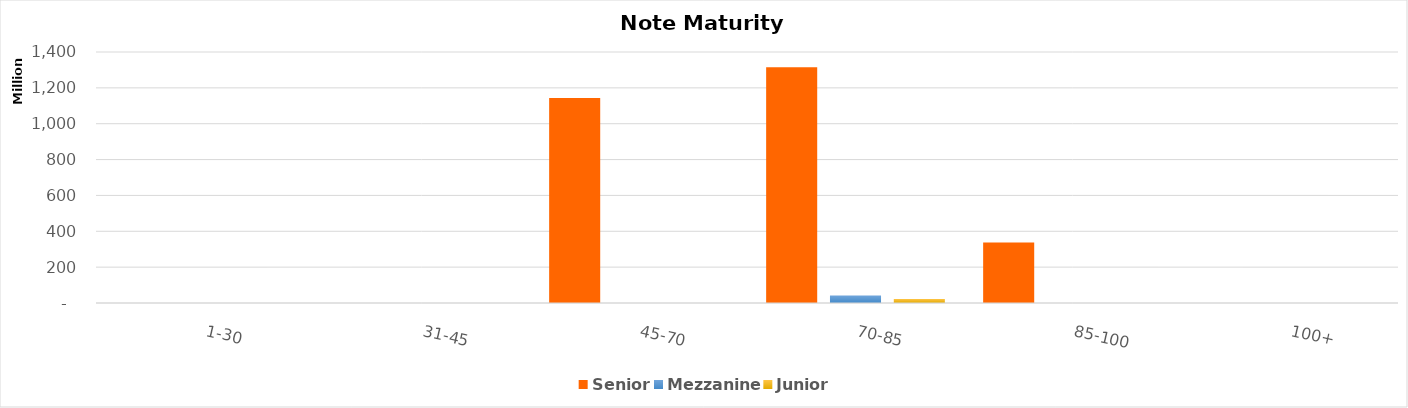
| Category | Senior | Mezzanine | Junior |
|---|---|---|---|
| 1-30 | 0 | 0 | 0 |
| 31-45 | 0 | 0 | 0 |
| 45-70 | 1143200000 | 0 | 0 |
| 70-85 | 1314580000 | 42000000 | 23000000 |
| 85-100 | 337220000 | 0 | 0 |
| 100+ | 0 | 0 | 0 |